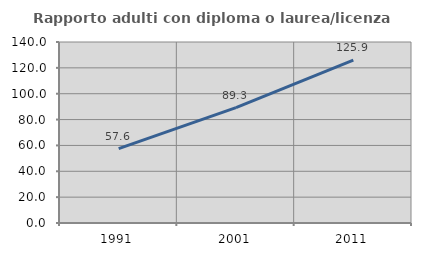
| Category | Rapporto adulti con diploma o laurea/licenza media  |
|---|---|
| 1991.0 | 57.582 |
| 2001.0 | 89.302 |
| 2011.0 | 125.915 |